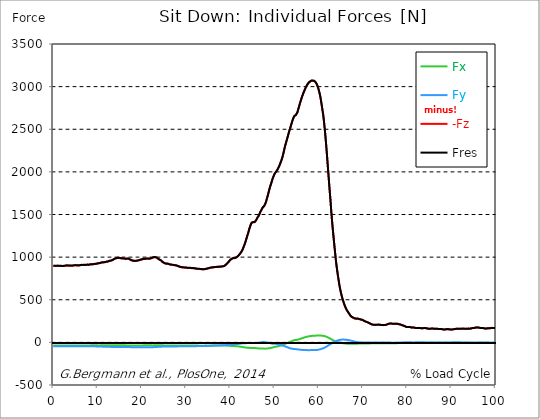
| Category |  Fx |  Fy |  -Fz |  Fres |
|---|---|---|---|---|
| 0.0 | -35.89 | -45.44 | 898 | 899.9 |
| 0.167348456675344 | -36 | -45.39 | 897.81 | 899.7 |
| 0.334696913350688 | -35.94 | -45.37 | 897.23 | 899.12 |
| 0.5020453700260321 | -35.8 | -45.32 | 896.83 | 898.71 |
| 0.669393826701376 | -35.51 | -45.24 | 896.78 | 898.65 |
| 0.83674228337672 | -35.94 | -45.04 | 898.21 | 900.08 |
| 1.0040907400520642 | -36.52 | -45.16 | 898.5 | 900.4 |
| 1.1621420602454444 | -36.18 | -45.4 | 897.11 | 899.02 |
| 1.3294905169207885 | -36.33 | -45.43 | 896.66 | 898.57 |
| 1.4968389735961325 | -36.37 | -45.28 | 896.51 | 898.42 |
| 1.6641874302714765 | -36.41 | -45.3 | 896.57 | 898.47 |
| 1.8315358869468206 | -36.4 | -45.54 | 896.37 | 898.29 |
| 1.9988843436221646 | -36.15 | -45.78 | 895.31 | 897.23 |
| 2.1662328002975086 | -36.08 | -45.61 | 895.34 | 897.25 |
| 2.333581256972853 | -36.05 | -45.39 | 895.5 | 897.39 |
| 2.5009297136481967 | -36.08 | -45.15 | 897.1 | 898.98 |
| 2.6682781703235405 | -36.11 | -44.91 | 898.72 | 900.59 |
| 2.8356266269988843 | -36.34 | -44.85 | 900.13 | 902 |
| 3.002975083674229 | -36.67 | -44.87 | 901.44 | 903.32 |
| 3.1703235403495724 | -36.6 | -44.85 | 901.7 | 903.58 |
| 3.337671997024917 | -36.35 | -44.84 | 900.95 | 902.82 |
| 3.4957233172182973 | -36.28 | -44.67 | 900.28 | 902.14 |
| 3.663071773893641 | -36.17 | -44.63 | 899.64 | 901.49 |
| 3.8304202305689854 | -35.97 | -44.53 | 899.1 | 900.94 |
| 3.997768687244329 | -35.77 | -44.34 | 898.75 | 900.57 |
| 4.165117143919673 | -35.71 | -44.24 | 898.87 | 900.69 |
| 4.332465600595017 | -35.81 | -44.26 | 899.64 | 901.46 |
| 4.499814057270361 | -35.98 | -44.31 | 900.66 | 902.49 |
| 4.667162513945706 | -36.29 | -44.41 | 902.33 | 904.17 |
| 4.834510970621049 | -36.6 | -44.51 | 904 | 905.86 |
| 5.001859427296393 | -36.68 | -44.67 | 904.6 | 906.47 |
| 5.169207883971737 | -36.56 | -44.9 | 903.84 | 905.71 |
| 5.336556340647081 | -36.09 | -45 | 902.37 | 904.23 |
| 5.503904797322425 | -35.63 | -45 | 901.47 | 903.32 |
| 5.671253253997769 | -35.61 | -45.05 | 902.1 | 903.95 |
| 5.82930457419115 | -35.54 | -45.01 | 902.9 | 904.74 |
| 5.996653030866494 | -35.51 | -44.93 | 903.91 | 905.74 |
| 6.164001487541838 | -35.73 | -44.66 | 905.95 | 907.78 |
| 6.331349944217181 | -36.18 | -44.64 | 907.76 | 909.6 |
| 6.498698400892526 | -36.32 | -45.05 | 907.74 | 909.6 |
| 6.66604685756787 | -36.06 | -45.29 | 906.83 | 908.69 |
| 6.833395314243213 | -36.28 | -45.2 | 907.75 | 909.62 |
| 7.000743770918558 | -36.63 | -45.34 | 908.62 | 910.51 |
| 7.168092227593902 | -36.2 | -45.73 | 907.76 | 909.65 |
| 7.335440684269246 | -35.63 | -45.87 | 907.17 | 909.05 |
| 7.50278914094459 | -35.68 | -45.61 | 908.98 | 910.84 |
| 7.6701375976199335 | -36.22 | -45.49 | 910.66 | 912.54 |
| 7.837486054295278 | -36.01 | -45.63 | 910.41 | 912.28 |
| 7.995537374488658 | -35.25 | -45.67 | 909.72 | 911.57 |
| 8.162885831164003 | -34.91 | -45.52 | 910.93 | 912.75 |
| 8.330234287839346 | -35.24 | -45.45 | 914.04 | 915.87 |
| 8.49758274451469 | -35.59 | -45.47 | 915.12 | 916.96 |
| 8.664931201190035 | -35.06 | -45.69 | 914.55 | 916.38 |
| 8.832279657865378 | -34.28 | -45.92 | 914.31 | 916.12 |
| 8.999628114540721 | -34.18 | -45.97 | 915.78 | 917.59 |
| 9.166976571216066 | -34.98 | -46 | 918.42 | 920.26 |
| 9.334325027891412 | -35.27 | -46.36 | 919.66 | 921.53 |
| 9.501673484566755 | -34.76 | -46.83 | 919.9 | 921.78 |
| 9.669021941242098 | -34.36 | -47.07 | 920.62 | 922.49 |
| 9.836370397917442 | -34.57 | -47.14 | 922.65 | 924.53 |
| 10.003718854592787 | -35.09 | -47.31 | 925.13 | 927.04 |
| 10.17106731126813 | -35.55 | -47.76 | 926.82 | 928.76 |
| 10.329118631461512 | -35.62 | -48.35 | 927.65 | 929.63 |
| 10.496467088136853 | -35.14 | -48.89 | 928.78 | 930.78 |
| 10.663815544812199 | -35.02 | -49.12 | 932.04 | 934.04 |
| 10.831164001487544 | -35.18 | -49.27 | 935.46 | 937.47 |
| 10.998512458162887 | -35.15 | -49.8 | 936.81 | 938.85 |
| 11.16586091483823 | -34.71 | -50.06 | 937.07 | 939.12 |
| 11.333209371513574 | -34.61 | -50.34 | 938.33 | 940.38 |
| 11.50055782818892 | -34.66 | -50.5 | 938.07 | 940.14 |
| 11.667906284864264 | -34.38 | -50.21 | 939.88 | 941.92 |
| 11.835254741539607 | -34.78 | -50.15 | 942.79 | 944.83 |
| 12.00260319821495 | -35.12 | -50.76 | 945.18 | 947.27 |
| 12.169951654890292 | -34.6 | -51.44 | 945.25 | 947.36 |
| 12.337300111565641 | -34.13 | -51.77 | 947.09 | 949.2 |
| 12.504648568240984 | -34.4 | -52.02 | 951.8 | 953.93 |
| 12.662699888434362 | -34.65 | -52.5 | 955.7 | 957.86 |
| 12.830048345109708 | -34.72 | -52.91 | 957.32 | 959.51 |
| 12.997396801785053 | -34.15 | -52.96 | 957.63 | 959.8 |
| 13.164745258460396 | -34.09 | -53.04 | 961.01 | 963.18 |
| 13.33209371513574 | -34.07 | -53.45 | 963.48 | 965.67 |
| 13.499442171811083 | -33.92 | -53.86 | 967.94 | 970.15 |
| 13.666790628486426 | -33.61 | -54.16 | 974.17 | 976.37 |
| 13.834139085161771 | -33.86 | -54.32 | 979.69 | 981.9 |
| 14.001487541837117 | -33.88 | -54.79 | 982.46 | 984.69 |
| 14.16883599851246 | -33.68 | -55.23 | 985.32 | 987.56 |
| 14.336184455187803 | -33.72 | -55.56 | 988.15 | 990.41 |
| 14.503532911863147 | -34.29 | -55.48 | 991.14 | 993.42 |
| 14.670881368538492 | -34.56 | -55.27 | 992.06 | 994.34 |
| 14.828932688731873 | -34.38 | -55.15 | 991.21 | 993.48 |
| 14.996281145407215 | -34.51 | -55.04 | 988.69 | 990.96 |
| 15.163629602082558 | -34.43 | -55.05 | 987.77 | 990.04 |
| 15.330978058757903 | -34.54 | -55.23 | 985.49 | 987.77 |
| 15.498326515433247 | -34.2 | -55.1 | 983.07 | 985.35 |
| 15.665674972108594 | -34.65 | -54.55 | 983.73 | 986 |
| 15.833023428783937 | -35.12 | -54.5 | 984.11 | 986.39 |
| 16.00037188545928 | -35.27 | -54.74 | 982.47 | 984.77 |
| 16.167720342134626 | -35.24 | -54.87 | 980.22 | 982.53 |
| 16.335068798809967 | -34.89 | -54.73 | 978.68 | 980.98 |
| 16.502417255485312 | -35.16 | -54.33 | 979.87 | 982.15 |
| 16.669765712160658 | -35.79 | -54.29 | 981.18 | 983.47 |
| 16.837114168836 | -36.17 | -54.34 | 980.98 | 983.3 |
| 17.004462625511344 | -36.64 | -54.29 | 980.59 | 982.93 |
| 17.16251394570472 | -36.86 | -54.79 | 976.8 | 979.17 |
| 17.32986240238007 | -36.58 | -55.32 | 971.38 | 973.77 |
| 17.497210859055414 | -36.3 | -55.84 | 965.93 | 968.35 |
| 17.664559315730756 | -36.15 | -56.17 | 962.09 | 964.51 |
| 17.8319077724061 | -36.96 | -56.16 | 958.85 | 961.31 |
| 17.999256229081443 | -37.41 | -56.21 | 956.48 | 958.97 |
| 18.166604685756788 | -37.44 | -56.29 | 956.86 | 959.36 |
| 18.333953142432133 | -37.55 | -56.26 | 955.95 | 958.46 |
| 18.501301599107478 | -37.37 | -56 | 955.38 | 957.86 |
| 18.668650055782823 | -37.32 | -55.85 | 955.36 | 957.84 |
| 18.835998512458165 | -37.27 | -55.77 | 956.34 | 958.8 |
| 19.00334696913351 | -36.92 | -55.82 | 958.1 | 960.55 |
| 19.170695425808855 | -36.45 | -56.16 | 959.82 | 962.27 |
| 19.338043882484197 | -36.05 | -56.46 | 961.78 | 964.22 |
| 19.496095202677576 | -36.15 | -56.5 | 965.67 | 968.11 |
| 19.66344365935292 | -36.4 | -56.65 | 968.59 | 971.04 |
| 19.830792116028263 | -35.92 | -57.04 | 970.04 | 972.49 |
| 19.998140572703612 | -35.32 | -56.89 | 971.68 | 974.08 |
| 20.165489029378953 | -35.28 | -56.64 | 974.71 | 977.09 |
| 20.3328374860543 | -35.23 | -56.56 | 977.29 | 979.67 |
| 20.500185942729644 | -34.89 | -56.61 | 978.99 | 981.36 |
| 20.667534399404985 | -34.52 | -57 | 978.04 | 980.42 |
| 20.83488285608033 | -34.17 | -57.18 | 978.35 | 980.71 |
| 21.002231312755672 | -34.3 | -57.05 | 980.87 | 983.23 |
| 21.16957976943102 | -34.55 | -57.09 | 981.94 | 984.31 |
| 21.336928226106362 | -34.43 | -57.49 | 980.8 | 983.19 |
| 21.504276682781704 | -34.07 | -57.67 | 979.16 | 981.55 |
| 21.67162513945705 | -34 | -57.38 | 980.11 | 982.48 |
| 21.82967645965043 | -34.47 | -57.04 | 982.54 | 984.9 |
| 21.997024916325774 | -34.59 | -57.12 | 983.91 | 986.26 |
| 22.16437337300112 | -35.11 | -56.93 | 986.08 | 988.44 |
| 22.33172182967646 | -35.4 | -56.62 | 990.1 | 992.45 |
| 22.499070286351806 | -35.4 | -56.33 | 994.7 | 997.03 |
| 22.666418743027148 | -35.05 | -55.83 | 997.52 | 999.81 |
| 22.833767199702496 | -34.87 | -55.73 | 998.24 | 1000.52 |
| 23.00111565637784 | -35.04 | -54.86 | 998.56 | 1000.81 |
| 23.168464113053183 | -35.06 | -54.15 | 997.77 | 1000 |
| 23.335812569728528 | -34.9 | -53.7 | 994.08 | 996.3 |
| 23.50316102640387 | -34.77 | -53.16 | 989.17 | 991.38 |
| 23.670509483079215 | -34.5 | -52.36 | 980.49 | 982.66 |
| 23.83785793975456 | -34.03 | -51.96 | 974.31 | 976.45 |
| 23.995909259947936 | -34.44 | -51.32 | 969.44 | 971.58 |
| 24.163257716623285 | -35.11 | -51.04 | 966.42 | 968.58 |
| 24.330606173298627 | -35.19 | -50.66 | 961.09 | 963.26 |
| 24.49795462997397 | -34.95 | -50.01 | 951.71 | 953.86 |
| 24.665303086649313 | -34.79 | -49.31 | 942.41 | 944.54 |
| 24.83265154332466 | -34.92 | -48.74 | 936.7 | 938.81 |
| 25.0 | -35.34 | -48.47 | 932.68 | 934.79 |
| 25.167348456675345 | -35.58 | -48.36 | 927.45 | 929.57 |
| 25.334696913350694 | -35.64 | -48.45 | 923.9 | 926.03 |
| 25.502045370026035 | -35.93 | -48.23 | 922.95 | 925.08 |
| 25.669393826701377 | -36.05 | -48.3 | 923.03 | 925.17 |
| 25.836742283376722 | -36.3 | -48.28 | 922.42 | 924.58 |
| 26.004090740052067 | -36.29 | -48.24 | 920.37 | 922.52 |
| 26.17143919672741 | -36.17 | -48.32 | 916.64 | 918.79 |
| 26.329490516920792 | -36.08 | -48.29 | 913.26 | 915.42 |
| 26.49683897359613 | -36.02 | -47.89 | 911.61 | 913.75 |
| 26.66418743027148 | -36.12 | -47.63 | 910.54 | 912.67 |
| 26.831535886946828 | -36.25 | -47.46 | 909.55 | 911.67 |
| 26.998884343622166 | -36.43 | -47.1 | 908.23 | 910.35 |
| 27.166232800297514 | -36.52 | -46.98 | 906.23 | 908.35 |
| 27.333581256972852 | -36.45 | -47.07 | 904.68 | 906.81 |
| 27.5009297136482 | -36.65 | -47.21 | 903.88 | 906.03 |
| 27.668278170323543 | -36.81 | -47.29 | 902.8 | 904.95 |
| 27.835626626998888 | -36.76 | -47.23 | 900.75 | 902.9 |
| 28.002975083674233 | -36.72 | -47.12 | 898.09 | 900.23 |
| 28.170323540349575 | -36.69 | -46.95 | 894.79 | 896.93 |
| 28.33767199702492 | -36.36 | -46.8 | 890.43 | 892.55 |
| 28.50502045370026 | -36.32 | -46.44 | 887.36 | 889.46 |
| 28.663071773893645 | -36.6 | -46.11 | 885.22 | 887.32 |
| 28.830420230568986 | -36.68 | -46.09 | 882.82 | 884.92 |
| 28.99776868724433 | -36.62 | -46.05 | 880.7 | 882.8 |
| 29.165117143919673 | -36.45 | -45.98 | 878.79 | 880.89 |
| 29.33246560059502 | -36.43 | -45.91 | 878.01 | 880.1 |
| 29.499814057270367 | -36.48 | -45.79 | 877.68 | 879.77 |
| 29.66716251394571 | -36.58 | -45.57 | 877.45 | 879.53 |
| 29.834510970621054 | -36.71 | -45.49 | 877.03 | 879.12 |
| 30.00185942729639 | -36.83 | -45.44 | 876.57 | 878.66 |
| 30.169207883971744 | -36.87 | -45.5 | 874.84 | 876.95 |
| 30.33655634064708 | -36.89 | -45.52 | 873.28 | 875.39 |
| 30.50390479732243 | -36.91 | -45.46 | 872.33 | 874.44 |
| 30.671253253997772 | -36.99 | -45.37 | 871.89 | 873.99 |
| 30.829304574191156 | -37.17 | -45.21 | 872.14 | 874.24 |
| 30.996653030866494 | -37.34 | -45.06 | 872.4 | 874.49 |
| 31.164001487541842 | -37.56 | -44.89 | 871.31 | 873.4 |
| 31.331349944217187 | -37.76 | -44.73 | 870.19 | 872.29 |
| 31.498698400892525 | -37.79 | -44.75 | 869.73 | 871.83 |
| 31.666046857567874 | -37.82 | -44.77 | 869.27 | 871.37 |
| 31.833395314243212 | -37.82 | -44.76 | 868.58 | 870.68 |
| 32.00074377091856 | -37.74 | -44.61 | 867.08 | 869.17 |
| 32.1680922275939 | -37.66 | -44.46 | 865.58 | 867.66 |
| 32.33544068426925 | -37.6 | -44.22 | 863.98 | 866.05 |
| 32.50278914094459 | -37.6 | -43.85 | 862.25 | 864.29 |
| 32.670137597619934 | -37.88 | -43.55 | 861.98 | 864.02 |
| 32.83748605429528 | -38.16 | -43.26 | 861.71 | 863.76 |
| 33.004834510970625 | -38.41 | -43 | 861.29 | 863.34 |
| 33.162885831164004 | -38.53 | -42.98 | 860.05 | 862.11 |
| 33.33023428783935 | -38.64 | -42.95 | 858.82 | 860.87 |
| 33.497582744514695 | -38.75 | -42.93 | 857.58 | 859.64 |
| 33.664931201190036 | -38.69 | -42.87 | 856.95 | 859 |
| 33.83227965786538 | -38.52 | -42.8 | 856.64 | 858.68 |
| 33.99962811454073 | -38.36 | -42.73 | 856.33 | 858.36 |
| 34.16697657121607 | -38.2 | -42.59 | 856.87 | 858.87 |
| 34.33432502789141 | -38.04 | -42.36 | 858.93 | 860.91 |
| 34.50167348456676 | -37.87 | -42.12 | 860.99 | 862.94 |
| 34.6690219412421 | -38.01 | -41.74 | 862.99 | 864.92 |
| 34.83637039791744 | -38.29 | -41.29 | 864.96 | 866.87 |
| 35.00371885459279 | -38.46 | -40.91 | 867.38 | 869.27 |
| 35.17106731126814 | -38.48 | -40.61 | 870.45 | 872.31 |
| 35.338415767943474 | -38.45 | -40.28 | 872.98 | 874.81 |
| 35.49646708813686 | -38.36 | -39.94 | 875.11 | 876.91 |
| 35.6638155448122 | -38.11 | -39.62 | 876.96 | 878.73 |
| 35.831164001487544 | -37.65 | -39.22 | 877.89 | 879.62 |
| 35.998512458162885 | -37.19 | -38.82 | 878.84 | 880.52 |
| 36.165860914838234 | -36.75 | -38.47 | 880.13 | 881.78 |
| 36.333209371513576 | -36.46 | -38.15 | 881.13 | 882.75 |
| 36.50055782818892 | -36.29 | -37.85 | 881.96 | 883.56 |
| 36.667906284864266 | -36.1 | -37.53 | 883.32 | 884.89 |
| 36.83525474153961 | -35.82 | -37.25 | 883.93 | 885.48 |
| 37.002603198214956 | -35.82 | -36.75 | 884.91 | 886.43 |
| 37.1699516548903 | -35.84 | -36.23 | 885.92 | 887.41 |
| 37.337300111565646 | -35.85 | -35.8 | 886.45 | 887.92 |
| 37.50464856824098 | -35.87 | -35.39 | 886.87 | 888.32 |
| 37.66269988843437 | -35.66 | -34.93 | 887.3 | 888.72 |
| 37.83004834510971 | -35.41 | -34.45 | 887.61 | 889.01 |
| 37.99739680178505 | -35.34 | -33.92 | 888.69 | 890.06 |
| 38.16474525846039 | -35.4 | -33.4 | 890.45 | 891.8 |
| 38.33209371513574 | -35.38 | -33.33 | 891.37 | 892.71 |
| 38.49944217181109 | -35.37 | -33.32 | 892.37 | 893.71 |
| 38.666790628486424 | -35.8 | -33.08 | 896.41 | 897.76 |
| 38.83413908516178 | -36.38 | -32.78 | 902.09 | 903.44 |
| 39.001487541837115 | -37.21 | -32.13 | 910.1 | 911.46 |
| 39.16883599851246 | -38.08 | -31.22 | 918.31 | 919.67 |
| 39.336184455187805 | -38.65 | -30.62 | 927.68 | 929.04 |
| 39.503532911863154 | -39.23 | -29.9 | 936.95 | 938.29 |
| 39.670881368538495 | -39.89 | -28.99 | 946.42 | 947.76 |
| 39.83822982521384 | -40.45 | -28.64 | 956.53 | 957.87 |
| 39.996281145407224 | -40.81 | -27.8 | 967.09 | 968.41 |
| 40.163629602082565 | -41.39 | -26.81 | 974.99 | 976.3 |
| 40.33097805875791 | -41.98 | -25.9 | 980.41 | 981.7 |
| 40.498326515433256 | -42.33 | -25.03 | 984.69 | 985.97 |
| 40.6656749721086 | -42.56 | -24.14 | 987.52 | 988.79 |
| 40.83302342878393 | -42.77 | -23.27 | 987.02 | 988.27 |
| 41.00037188545929 | -43.5 | -22.4 | 988.28 | 989.54 |
| 41.16772034213463 | -44.29 | -21.28 | 991.76 | 993.04 |
| 41.33506879880997 | -44.56 | -20.84 | 994.86 | 996.15 |
| 41.50241725548531 | -45.34 | -19.96 | 1000.75 | 1002.06 |
| 41.66976571216066 | -46.33 | -19.04 | 1007.84 | 1009.18 |
| 41.837114168836 | -47.7 | -17.86 | 1016.67 | 1018.05 |
| 42.004462625511344 | -48.92 | -16.85 | 1025.86 | 1027.28 |
| 42.17181108218669 | -49.91 | -15.92 | 1035.75 | 1037.18 |
| 42.32986240238007 | -50.85 | -14.61 | 1048.46 | 1049.9 |
| 42.497210859055414 | -51.78 | -13.16 | 1060.71 | 1062.15 |
| 42.66455931573076 | -52.98 | -12 | 1075.45 | 1076.91 |
| 42.831907772406105 | -54.72 | -11.05 | 1093.67 | 1095.19 |
| 42.999256229081446 | -56.6 | -10.35 | 1115.53 | 1117.11 |
| 43.16660468575679 | -58.2 | -9.7 | 1138.93 | 1140.55 |
| 43.33395314243214 | -59.39 | -9.1 | 1161.46 | 1163.11 |
| 43.50130159910748 | -60.7 | -8.88 | 1189.15 | 1190.83 |
| 43.66865005578282 | -61.91 | -8.96 | 1217.96 | 1219.67 |
| 43.83599851245817 | -62.62 | -8.5 | 1247 | 1248.69 |
| 44.00334696913351 | -63.47 | -8.26 | 1273.61 | 1275.32 |
| 44.17069542580886 | -64.32 | -8.34 | 1304.56 | 1306.27 |
| 44.3380438824842 | -64.85 | -8.39 | 1335.04 | 1336.73 |
| 44.49609520267758 | -64.98 | -8.26 | 1360.23 | 1361.89 |
| 44.66344365935292 | -64.69 | -7.83 | 1384.98 | 1386.6 |
| 44.83079211602827 | -64.65 | -7.68 | 1402.14 | 1403.74 |
| 44.99814057270361 | -65.22 | -7.65 | 1410.51 | 1412.12 |
| 45.16548902937895 | -65.34 | -7.32 | 1409.88 | 1411.49 |
| 45.332837486054295 | -65.77 | -6.75 | 1407.38 | 1409 |
| 45.500185942729644 | -66.29 | -6.64 | 1410.02 | 1411.65 |
| 45.66753439940499 | -66.85 | -6.68 | 1416.2 | 1417.85 |
| 45.83488285608033 | -67.24 | -6.74 | 1431.18 | 1432.84 |
| 46.00223131275568 | -68.56 | -7.29 | 1447.65 | 1449.35 |
| 46.16957976943102 | -69.56 | -6.83 | 1464.42 | 1466.16 |
| 46.336928226106366 | -70.67 | -5.72 | 1476.12 | 1477.9 |
| 46.50427668278171 | -71.54 | -4.06 | 1491.55 | 1493.38 |
| 46.671625139457056 | -71.9 | -2.37 | 1513.26 | 1515.11 |
| 46.829676459650436 | -72.1 | -0.54 | 1532.13 | 1534.03 |
| 46.99702491632577 | -72.38 | 1.43 | 1548.38 | 1550.33 |
| 47.16437337300112 | -72.44 | 3.09 | 1565.62 | 1567.6 |
| 47.33172182967646 | -72.49 | 3.76 | 1581.2 | 1583.19 |
| 47.49907028635181 | -72.74 | 4.03 | 1589.66 | 1591.65 |
| 47.66641874302716 | -73.1 | 4.06 | 1598.43 | 1600.4 |
| 47.83376719970249 | -73.47 | 2.91 | 1615.98 | 1617.93 |
| 48.001115656377834 | -73.66 | 1.31 | 1635.89 | 1637.79 |
| 48.16846411305319 | -73.49 | -0.49 | 1663.21 | 1665.07 |
| 48.33581256972853 | -72.35 | -1.84 | 1694.39 | 1696.16 |
| 48.50316102640387 | -70.92 | -3.11 | 1726.08 | 1727.74 |
| 48.67050948307921 | -69.29 | -4.57 | 1759.68 | 1761.26 |
| 48.837857939754564 | -68.26 | -6.33 | 1793.19 | 1794.73 |
| 49.005206396429905 | -67.2 | -8.93 | 1823.76 | 1825.23 |
| 49.163257716623285 | -65.56 | -11.31 | 1851.31 | 1852.68 |
| 49.33060617329863 | -63.57 | -13.5 | 1877.25 | 1878.51 |
| 49.49795462997397 | -61.02 | -14.87 | 1907.56 | 1908.74 |
| 49.66530308664932 | -57.97 | -15.68 | 1931.96 | 1933.05 |
| 49.832651543324666 | -55.35 | -16.31 | 1953.39 | 1954.4 |
| 50.0 | -53.17 | -16.93 | 1974.32 | 1975.28 |
| 50.16734845667534 | -51.61 | -17.29 | 1988.04 | 1988.96 |
| 50.33469691335069 | -50.2 | -17.61 | 1998.94 | 1999.82 |
| 50.50204537002604 | -48.67 | -18.59 | 2011.58 | 2012.41 |
| 50.66939382670139 | -46.73 | -19.93 | 2025.98 | 2026.76 |
| 50.836742283376715 | -44.35 | -21.65 | 2042.29 | 2043 |
| 51.00409074005207 | -42.14 | -23.52 | 2059.8 | 2060.47 |
| 51.17143919672741 | -40.02 | -25.71 | 2080.1 | 2080.74 |
| 51.32949051692079 | -37.71 | -28.29 | 2103.67 | 2104.28 |
| 51.496838973596134 | -34.74 | -31.76 | 2126.2 | 2126.79 |
| 51.66418743027148 | -31.92 | -34.83 | 2150.58 | 2151.15 |
| 51.831535886946824 | -29.35 | -37.27 | 2179.15 | 2179.71 |
| 51.99888434362217 | -26.76 | -39.93 | 2214.22 | 2214.78 |
| 52.16623280029752 | -23.35 | -42.8 | 2252.48 | 2253.05 |
| 52.33358125697285 | -19.34 | -45.66 | 2290.65 | 2291.25 |
| 52.5009297136482 | -15.56 | -48.69 | 2322.76 | 2323.37 |
| 52.668278170323546 | -11.79 | -51.82 | 2353.12 | 2353.76 |
| 52.835626626998895 | -8.19 | -55.13 | 2383.5 | 2384.19 |
| 53.00297508367424 | -4.99 | -58.73 | 2414.5 | 2415.25 |
| 53.17032354034958 | -1.62 | -62.34 | 2446.07 | 2446.91 |
| 53.33767199702492 | 2.14 | -65.53 | 2477.27 | 2478.18 |
| 53.50502045370027 | 5.6 | -68.6 | 2503.59 | 2504.58 |
| 53.663071773893655 | 9.21 | -71.25 | 2532.63 | 2533.7 |
| 53.83042023056899 | 12.83 | -73.16 | 2562.63 | 2563.76 |
| 53.99776868724433 | 16.46 | -74.75 | 2590.94 | 2592.13 |
| 54.16511714391967 | 19.96 | -76.14 | 2616.6 | 2617.83 |
| 54.33246560059503 | 23.3 | -77.48 | 2639.15 | 2640.44 |
| 54.49981405727037 | 26.28 | -78.18 | 2654.9 | 2656.22 |
| 54.667162513945705 | 28.48 | -78.82 | 2661.55 | 2662.91 |
| 54.834510970621054 | 28.62 | -79.51 | 2665.91 | 2667.29 |
| 55.0018594272964 | 28.95 | -80.3 | 2673.22 | 2674.62 |
| 55.169207883971744 | 30.37 | -81.61 | 2696.7 | 2698.15 |
| 55.336556340647086 | 32.9 | -82.61 | 2726.69 | 2728.18 |
| 55.50390479732243 | 35.6 | -84.42 | 2755.67 | 2757.23 |
| 55.671253253997776 | 38.64 | -85.56 | 2786.8 | 2788.42 |
| 55.83860171067312 | 41.26 | -86.29 | 2817.08 | 2818.74 |
| 55.9966530308665 | 44.05 | -87.08 | 2843.26 | 2844.97 |
| 56.16400148754184 | 47.34 | -87.95 | 2871.56 | 2873.33 |
| 56.33134994421718 | 50.49 | -88.68 | 2895.23 | 2897.06 |
| 56.498698400892536 | 53.86 | -89.13 | 2919.1 | 2920.99 |
| 56.66604685756788 | 56.65 | -89.6 | 2940.69 | 2942.62 |
| 56.83339531424321 | 59.12 | -89.63 | 2960.58 | 2962.55 |
| 57.00074377091856 | 61.73 | -89.65 | 2980.88 | 2982.89 |
| 57.16809222759391 | 64.16 | -90.08 | 2999.38 | 3001.44 |
| 57.33544068426925 | 66.12 | -90.65 | 3014.42 | 3016.53 |
| 57.5027891409446 | 68.08 | -91.18 | 3029.15 | 3031.31 |
| 57.670137597619934 | 69.9 | -91.63 | 3041.32 | 3043.53 |
| 57.83748605429528 | 71.51 | -91.76 | 3050.8 | 3053.04 |
| 58.004834510970625 | 72.94 | -90.99 | 3057.11 | 3059.36 |
| 58.16288583116401 | 74.09 | -90.46 | 3063.98 | 3066.23 |
| 58.330234287839346 | 75.32 | -90.19 | 3068.7 | 3070.97 |
| 58.497582744514695 | 76.79 | -90.41 | 3069.73 | 3072.05 |
| 58.66493120119004 | 77.01 | -90.42 | 3068.95 | 3071.27 |
| 58.832279657865385 | 77.4 | -90.49 | 3067.71 | 3070.05 |
| 58.999628114540734 | 77.91 | -90.53 | 3066.22 | 3068.58 |
| 59.16697657121607 | 78.37 | -90.44 | 3058.96 | 3061.33 |
| 59.33432502789142 | 79 | -90.26 | 3047.68 | 3050.07 |
| 59.50167348456676 | 79.4 | -89.64 | 3032.79 | 3035.18 |
| 59.66902194124211 | 79.82 | -88.51 | 3013.85 | 3016.23 |
| 59.83637039791745 | 80.2 | -87.05 | 2990.2 | 2992.57 |
| 60.00371885459278 | 80.42 | -85.2 | 2961.16 | 2963.5 |
| 60.17106731126813 | 80.12 | -82.9 | 2927.33 | 2929.62 |
| 60.33841576794349 | 80.1 | -80.76 | 2888.55 | 2890.81 |
| 60.49646708813685 | 79.83 | -78.11 | 2839.93 | 2842.15 |
| 60.6638155448122 | 79.08 | -75.31 | 2785.06 | 2787.23 |
| 60.831164001487544 | 78.23 | -72.55 | 2727.21 | 2729.32 |
| 60.99851245816289 | 76.98 | -69.83 | 2673.66 | 2675.71 |
| 61.16586091483824 | 75.38 | -66 | 2600.54 | 2602.5 |
| 61.333209371513576 | 73.42 | -61.65 | 2516.93 | 2518.79 |
| 61.50055782818892 | 71.06 | -57.25 | 2425.59 | 2427.35 |
| 61.667906284864266 | 67.83 | -52.47 | 2324.83 | 2326.46 |
| 61.835254741539615 | 64.04 | -47.23 | 2218.24 | 2219.72 |
| 62.002603198214956 | 60.04 | -41.46 | 2102.65 | 2103.97 |
| 62.16995165489029 | 55.93 | -35.81 | 1988.75 | 1989.92 |
| 62.33730011156564 | 51.53 | -30.38 | 1875.87 | 1876.89 |
| 62.504648568240995 | 47.04 | -25.21 | 1764.92 | 1765.78 |
| 62.67199702491633 | 42.71 | -20.61 | 1660.8 | 1661.55 |
| 62.83004834510971 | 37.02 | -14.88 | 1537.45 | 1538.05 |
| 62.99739680178505 | 31.97 | -9.68 | 1431.21 | 1431.7 |
| 63.1647452584604 | 27.46 | -4.77 | 1334.61 | 1335 |
| 63.33209371513575 | 23.33 | -0.4 | 1245.93 | 1246.26 |
| 63.4994421718111 | 19.37 | 4.4 | 1155.35 | 1155.63 |
| 63.666790628486424 | 15.38 | 8.76 | 1069.87 | 1070.13 |
| 63.83413908516177 | 11.12 | 13 | 984.68 | 984.96 |
| 64.00148754183712 | 8.11 | 17.53 | 910.2 | 910.52 |
| 64.16883599851248 | 5.4 | 20.69 | 845.79 | 846.16 |
| 64.3361844551878 | 2.57 | 23.29 | 784.47 | 784.92 |
| 64.50353291186315 | 0.29 | 25.83 | 729.87 | 730.43 |
| 64.6708813685385 | -1.94 | 28.46 | 673.34 | 674.06 |
| 64.83822982521384 | -3.98 | 30.1 | 629.08 | 629.92 |
| 65.00557828188919 | -5.81 | 31.38 | 586.48 | 587.47 |
| 65.16362960208257 | -7.39 | 31.98 | 551.75 | 552.83 |
| 65.3309780587579 | -8.83 | 32.45 | 518.49 | 519.68 |
| 65.49832651543326 | -10.05 | 32.61 | 489.77 | 491.05 |
| 65.6656749721086 | -11.06 | 32.45 | 463.43 | 464.79 |
| 65.83302342878395 | -12.17 | 32.11 | 437.78 | 439.24 |
| 66.00037188545929 | -13.2 | 31.49 | 415.78 | 417.31 |
| 66.16772034213463 | -14.21 | 30.81 | 396.34 | 397.94 |
| 66.33506879880998 | -15.13 | 29.83 | 379.58 | 381.21 |
| 66.50241725548531 | -15.58 | 28.58 | 365.26 | 366.87 |
| 66.66976571216065 | -15.9 | 27.11 | 351.75 | 353.32 |
| 66.83711416883601 | -16.19 | 25.59 | 338.96 | 340.5 |
| 67.00446262551135 | -16.29 | 24.06 | 325.36 | 326.87 |
| 67.1718110821867 | -15.77 | 21.91 | 312.39 | 313.76 |
| 67.32986240238007 | -15.58 | 19.83 | 303.73 | 304.99 |
| 67.49721085905541 | -15.46 | 17.55 | 297.07 | 298.19 |
| 67.66455931573076 | -15.68 | 15.64 | 292.32 | 293.35 |
| 67.83190777240611 | -15.36 | 13.86 | 288.18 | 289.12 |
| 67.99925622908145 | -14.76 | 11.35 | 283.39 | 284.19 |
| 68.16660468575678 | -14.64 | 8.98 | 280.25 | 280.99 |
| 68.33395314243214 | -14.75 | 6.79 | 278.39 | 279.07 |
| 68.50130159910749 | -14.74 | 5.15 | 277.86 | 278.51 |
| 68.66865005578282 | -14.87 | 3.67 | 278.25 | 278.89 |
| 68.83599851245816 | -14.89 | 2.51 | 278.44 | 279.08 |
| 69.00334696913352 | -14.55 | 1.56 | 276.49 | 277.12 |
| 69.17069542580886 | -14.29 | 0.85 | 273.54 | 274.17 |
| 69.3380438824842 | -13.84 | 0.18 | 270.28 | 270.92 |
| 69.50539233915956 | -13.47 | -0.62 | 267.88 | 268.52 |
| 69.66344365935292 | -13.56 | -1.02 | 266.87 | 267.51 |
| 69.83079211602826 | -13.55 | -1.2 | 264.6 | 265.25 |
| 69.99814057270362 | -13.27 | -1.17 | 259.85 | 260.5 |
| 70.16548902937896 | -13.01 | -0.89 | 255.22 | 255.87 |
| 70.33283748605429 | -12.52 | -1.41 | 249.28 | 249.91 |
| 70.50018594272964 | -12.39 | -1.77 | 245.38 | 245.98 |
| 70.667534399405 | -12.48 | -1.74 | 243.11 | 243.72 |
| 70.83488285608033 | -12.7 | -1.44 | 240.03 | 240.65 |
| 71.00223131275568 | -12.5 | -1.56 | 234.7 | 235.31 |
| 71.16957976943102 | -12.53 | -2.23 | 232.19 | 232.79 |
| 71.33692822610637 | -12.75 | -1.79 | 229.73 | 230.34 |
| 71.50427668278171 | -12.13 | -1.52 | 224.14 | 224.72 |
| 71.67162513945706 | -11.6 | -1.22 | 218.1 | 218.64 |
| 71.8389735961324 | -11.46 | -0.98 | 213.66 | 214.18 |
| 71.99702491632577 | -11.69 | -1.08 | 210.94 | 211.47 |
| 72.16437337300113 | -11.89 | -1.28 | 208.66 | 209.2 |
| 72.33172182967647 | -11.66 | -1.52 | 206.26 | 206.78 |
| 72.49907028635181 | -11.5 | -1.56 | 205.46 | 205.97 |
| 72.66641874302715 | -11.36 | -1.31 | 205.29 | 205.79 |
| 72.8337671997025 | -11.22 | -1.22 | 205.12 | 205.62 |
| 73.00111565637783 | -11.34 | -1.31 | 205.73 | 206.25 |
| 73.16846411305319 | -11.48 | -1.45 | 207 | 207.52 |
| 73.33581256972853 | -11.42 | -1.44 | 207.95 | 208.47 |
| 73.50316102640387 | -11.25 | -1.36 | 208.21 | 208.73 |
| 73.67050948307921 | -10.95 | -1.48 | 207.89 | 208.37 |
| 73.83785793975457 | -10.9 | -1.46 | 206.14 | 206.59 |
| 74.00520639642991 | -10.69 | -1.24 | 204.39 | 204.8 |
| 74.16325771662328 | -10.94 | -0.79 | 204.12 | 204.53 |
| 74.33060617329863 | -11.07 | -0.61 | 203.14 | 203.55 |
| 74.49795462997398 | -11.16 | -0.51 | 201.96 | 202.37 |
| 74.66530308664932 | -10.81 | -0.78 | 202.14 | 202.53 |
| 74.83265154332466 | -10.65 | -0.79 | 203.05 | 203.44 |
| 75.00000000000001 | -10.67 | -0.7 | 203.83 | 204.21 |
| 75.16734845667534 | -10.65 | -1.24 | 205.41 | 205.79 |
| 75.3346969133507 | -10.75 | -1.99 | 208 | 208.37 |
| 75.50204537002605 | -11.13 | -2.15 | 211.33 | 211.71 |
| 75.66939382670138 | -10.99 | -2.67 | 214.9 | 215.27 |
| 75.83674228337672 | -11.19 | -2.78 | 217.94 | 218.32 |
| 76.00409074005208 | -11.18 | -3 | 219.86 | 220.23 |
| 76.17143919672742 | -11.04 | -3.18 | 221.57 | 221.95 |
| 76.33878765340276 | -10.84 | -3.29 | 221.78 | 222.15 |
| 76.49683897359614 | -10.64 | -3.47 | 220.09 | 220.44 |
| 76.66418743027148 | -10.07 | -3.91 | 218.02 | 218.35 |
| 76.83153588694682 | -9.54 | -4.21 | 216.99 | 217.3 |
| 76.99888434362218 | -9.71 | -3.74 | 217.87 | 218.19 |
| 77.16623280029752 | -9.5 | -3.55 | 217.46 | 217.77 |
| 77.33358125697285 | -9.13 | -3.76 | 216.72 | 217.03 |
| 77.5009297136482 | -9.19 | -3.43 | 218.53 | 218.83 |
| 77.66827817032356 | -9.21 | -2.96 | 218.85 | 219.14 |
| 77.83562662699889 | -8.94 | -3.04 | 217.32 | 217.61 |
| 78.00297508367423 | -8.52 | -3.13 | 214.86 | 215.14 |
| 78.17032354034959 | -8.04 | -3.02 | 211.79 | 212.05 |
| 78.33767199702493 | -8.65 | -2.19 | 211.77 | 212.05 |
| 78.50502045370027 | -8.73 | -1.62 | 209.65 | 209.93 |
| 78.67236891037561 | -8.47 | -1.38 | 205.29 | 205.57 |
| 78.83042023056899 | -8.2 | -1.19 | 201.41 | 201.68 |
| 78.99776868724433 | -8.33 | -0.63 | 199.66 | 199.94 |
| 79.16511714391969 | -8.1 | -0.13 | 196.57 | 196.85 |
| 79.33246560059503 | -8.11 | 0.09 | 192.51 | 192.79 |
| 79.49981405727036 | -7.91 | 0.36 | 188.44 | 188.73 |
| 79.66716251394571 | -7.82 | 0.79 | 183.8 | 184.1 |
| 79.83451097062107 | -7.59 | 0.59 | 180.67 | 180.97 |
| 80.00185942729641 | -7.78 | 0.8 | 180.24 | 180.55 |
| 80.16920788397174 | -7.93 | 0.98 | 179.97 | 180.27 |
| 80.33655634064709 | -8.4 | 0.83 | 181.07 | 181.39 |
| 80.50390479732243 | -8.41 | 0.65 | 181.58 | 181.9 |
| 80.67125325399778 | -8.16 | 0.83 | 179.6 | 179.93 |
| 80.83860171067312 | -7.68 | 0.56 | 176.22 | 176.54 |
| 80.99665303086651 | -7.47 | 0.04 | 174.35 | 174.66 |
| 81.16400148754184 | -7.37 | -0.03 | 173.54 | 173.85 |
| 81.3313499442172 | -7.24 | -0.39 | 172.64 | 172.96 |
| 81.49869840089255 | -7.4 | -0.26 | 173.71 | 174.05 |
| 81.66604685756786 | -7.21 | -0.04 | 172.46 | 172.8 |
| 81.83339531424322 | -7.03 | 0.27 | 170.19 | 170.51 |
| 82.00074377091858 | -6.59 | 0.13 | 167.76 | 168.09 |
| 82.16809222759392 | -6.41 | -0.05 | 167.42 | 167.73 |
| 82.33544068426926 | -6.71 | -0.04 | 168.52 | 168.85 |
| 82.50278914094459 | -6.97 | 0.12 | 169.78 | 170.13 |
| 82.67013759761994 | -7.15 | 0.38 | 170.84 | 171.19 |
| 82.83748605429528 | -6.83 | 0.6 | 169.37 | 169.71 |
| 83.00483451097062 | -6.3 | 0.3 | 167.1 | 167.42 |
| 83.17218296764597 | -6.07 | 0.31 | 165.85 | 166.15 |
| 83.33023428783935 | -6.17 | 0.41 | 166.06 | 166.36 |
| 83.4975827445147 | -5.89 | 0.07 | 165.47 | 165.74 |
| 83.66493120119004 | -6.2 | 0.28 | 167.37 | 167.65 |
| 83.83227965786537 | -6.4 | 0.35 | 168.33 | 168.62 |
| 83.99962811454073 | -6.39 | 0.14 | 168.44 | 168.72 |
| 84.16697657121607 | -6.05 | -0.17 | 167.15 | 167.42 |
| 84.33432502789142 | -5.69 | -0.41 | 165.48 | 165.74 |
| 84.50167348456677 | -5.38 | -0.79 | 163.61 | 163.87 |
| 84.6690219412421 | -5.11 | -1.23 | 161.71 | 161.97 |
| 84.83637039791745 | -4.98 | -1.55 | 160.57 | 160.84 |
| 85.0037188545928 | -5.02 | -1.71 | 160.23 | 160.51 |
| 85.17106731126813 | -5.09 | -1.85 | 159.8 | 160.08 |
| 85.33841576794349 | -5.12 | -1.84 | 159.96 | 160.24 |
| 85.50576422461883 | -5.32 | -1.76 | 161.53 | 161.81 |
| 85.66381554481221 | -5.47 | -1.7 | 161.85 | 162.14 |
| 85.83116400148755 | -5.65 | -1.61 | 161.71 | 162 |
| 85.99851245816289 | -5.37 | -1.81 | 160.28 | 160.56 |
| 86.16586091483823 | -5.03 | -2.06 | 158.97 | 159.26 |
| 86.33320937151358 | -4.74 | -2.25 | 158.38 | 158.67 |
| 86.50055782818893 | -4.93 | -2.09 | 159.31 | 159.61 |
| 86.66790628486427 | -5.07 | -1.87 | 160.21 | 160.51 |
| 86.83525474153961 | -4.94 | -1.57 | 159.46 | 159.76 |
| 87.00260319821496 | -4.66 | -1.56 | 157.84 | 158.14 |
| 87.16995165489031 | -4.35 | -2.07 | 155.58 | 155.89 |
| 87.33730011156564 | -4.55 | -2.18 | 155.51 | 155.83 |
| 87.504648568241 | -4.35 | -2.02 | 156.16 | 156.47 |
| 87.67199702491634 | -4.05 | -1.88 | 155.97 | 156.26 |
| 87.83004834510972 | -3.74 | -1.77 | 155.03 | 155.33 |
| 87.99739680178506 | -3.4 | -1.84 | 152.78 | 153.07 |
| 88.1647452584604 | -3.17 | -1.9 | 151.68 | 151.98 |
| 88.33209371513574 | -3.08 | -1.82 | 151.32 | 151.62 |
| 88.49944217181108 | -2.99 | -1.67 | 151.36 | 151.65 |
| 88.66679062848644 | -2.89 | -1.62 | 151.96 | 152.25 |
| 88.83413908516178 | -3.1 | -1.44 | 153.42 | 153.73 |
| 89.00148754183712 | -3.46 | -1.04 | 154.93 | 155.25 |
| 89.16883599851246 | -3.78 | -0.63 | 155.68 | 156 |
| 89.33618445518782 | -3.86 | -0.55 | 155.18 | 155.5 |
| 89.50353291186315 | -3.75 | -0.48 | 153.21 | 153.53 |
| 89.6708813685385 | -3.69 | -0.48 | 151.7 | 152.02 |
| 89.83822982521386 | -3.63 | -0.48 | 150.19 | 150.51 |
| 90.00557828188919 | -3.76 | -0.19 | 150.62 | 150.92 |
| 90.16362960208257 | -3.9 | 0.09 | 151.13 | 151.43 |
| 90.3309780587579 | -4.17 | 0.14 | 152.41 | 152.72 |
| 90.49832651543326 | -4.36 | 0.13 | 153.6 | 153.93 |
| 90.66567497210859 | -4.33 | 0.01 | 154.95 | 155.29 |
| 90.83302342878395 | -4.47 | -0.03 | 157.07 | 157.41 |
| 91.00037188545929 | -4.55 | 0.14 | 158.32 | 158.66 |
| 91.16772034213463 | -4.62 | 0.34 | 159.44 | 159.79 |
| 91.33506879880998 | -4.69 | 0.53 | 159.68 | 160.04 |
| 91.50241725548533 | -4.47 | 0.42 | 158.71 | 159.08 |
| 91.66976571216065 | -4.22 | 0.1 | 158.01 | 158.38 |
| 91.83711416883601 | -4.48 | -0.05 | 159.11 | 159.48 |
| 92.00446262551137 | -4.83 | -0.04 | 160.43 | 160.81 |
| 92.1718110821867 | -4.82 | -0.02 | 160.21 | 160.57 |
| 92.33915953886203 | -4.72 | -0.46 | 160.37 | 160.72 |
| 92.49721085905541 | -4.91 | -0.67 | 161.28 | 161.63 |
| 92.66455931573077 | -5.08 | -0.84 | 161.67 | 162 |
| 92.83190777240611 | -4.93 | -1.1 | 160.84 | 161.15 |
| 92.99925622908145 | -4.48 | -1.27 | 158.53 | 158.81 |
| 93.1666046857568 | -4.38 | -1.73 | 158.31 | 158.58 |
| 93.33395314243214 | -4.31 | -2.01 | 158.61 | 158.86 |
| 93.50130159910749 | -4.57 | -2.23 | 159.89 | 160.12 |
| 93.66865005578283 | -4.73 | -2.45 | 160.88 | 161.09 |
| 93.83599851245818 | -4.86 | -2.46 | 161.39 | 161.59 |
| 94.00334696913353 | -4.32 | -2.75 | 160.05 | 160.23 |
| 94.17069542580886 | -4.37 | -2.73 | 160.48 | 160.67 |
| 94.3380438824842 | -4.42 | -2.72 | 161.09 | 161.27 |
| 94.50539233915954 | -4.25 | -2.93 | 163.75 | 163.93 |
| 94.66344365935292 | -4.15 | -3.08 | 166.43 | 166.61 |
| 94.83079211602828 | -4.46 | -2.92 | 169.2 | 169.37 |
| 94.99814057270362 | -4.26 | -3.05 | 169.44 | 169.61 |
| 95.16548902937897 | -3.88 | -3.23 | 169.62 | 169.79 |
| 95.33283748605432 | -4.14 | -3.14 | 171.74 | 171.92 |
| 95.50018594272963 | -4.38 | -3.02 | 173.82 | 174 |
| 95.66753439940499 | -4.6 | -2.87 | 175.33 | 175.51 |
| 95.83488285608034 | -4.26 | -2.89 | 175.48 | 175.66 |
| 96.00223131275567 | -4.15 | -2.82 | 174.86 | 175.03 |
| 96.16957976943102 | -4.17 | -2.55 | 173.64 | 173.8 |
| 96.33692822610638 | -3.95 | -2.39 | 171.88 | 172.04 |
| 96.50427668278171 | -3.85 | -2.3 | 169.69 | 169.86 |
| 96.67162513945706 | -3.72 | -2.43 | 167.83 | 168.01 |
| 96.8389735961324 | -4.01 | -2.27 | 167.62 | 167.81 |
| 96.99702491632577 | -4.54 | -1.92 | 168.28 | 168.47 |
| 97.16437337300111 | -4.91 | -1.71 | 167.69 | 167.89 |
| 97.33172182967647 | -4.44 | -1.71 | 165.23 | 165.41 |
| 97.49907028635181 | -4.21 | -1.73 | 163.09 | 163.28 |
| 97.66641874302715 | -3.99 | -2.04 | 162.49 | 162.69 |
| 97.8337671997025 | -4.14 | -2.14 | 163.01 | 163.23 |
| 98.00111565637785 | -4.32 | -2.21 | 163.62 | 163.85 |
| 98.16846411305319 | -4.5 | -2.15 | 164.33 | 164.57 |
| 98.33581256972855 | -4.69 | -2.22 | 164.9 | 165.13 |
| 98.50316102640389 | -4.59 | -2.89 | 164.38 | 164.6 |
| 98.67050948307921 | -4.34 | -3.83 | 164.31 | 164.53 |
| 98.83785793975456 | -4.67 | -3.94 | 166.89 | 167.11 |
| 99.0052063964299 | -4.73 | -4.29 | 168.92 | 169.13 |
| 99.17255485310525 | -4.57 | -4.74 | 170.28 | 170.48 |
| 99.33060617329863 | -4.21 | -4.99 | 169.55 | 169.75 |
| 99.49795462997399 | -3.92 | -5.18 | 168.55 | 168.75 |
| 99.66530308664933 | -3.76 | -5.3 | 167.36 | 167.57 |
| 99.83265154332467 | -3.91 | -5.34 | 168.02 | 168.24 |
| 100.0 | -4.34 | -5.09 | 169.3 | 169.52 |